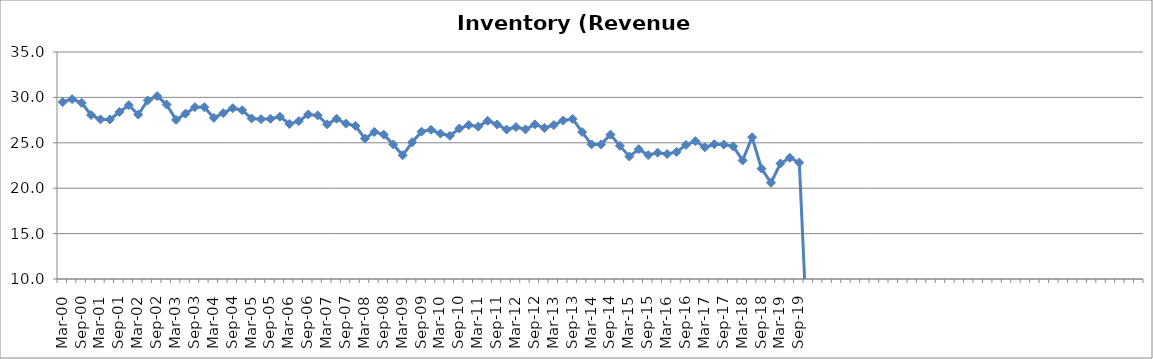
| Category | Inventory (Revenue Days) |
|---|---|
| Mar-00 | 29.487 |
| Jun-00 | 29.806 |
| Sep-00 | 29.403 |
| Dec-00 | 28.06 |
| Mar-01 | 27.572 |
| Jun-01 | 27.572 |
| Sep-01 | 28.397 |
| Dec-01 | 29.145 |
| Mar-02 | 28.109 |
| Jun-02 | 29.663 |
| Sep-02 | 30.14 |
| Dec-02 | 29.213 |
| Mar-03 | 27.527 |
| Jun-03 | 28.21 |
| Sep-03 | 28.927 |
| Dec-03 | 28.922 |
| Mar-04 | 27.749 |
| Jun-04 | 28.277 |
| Sep-04 | 28.811 |
| Dec-04 | 28.595 |
| Mar-05 | 27.682 |
| Jun-05 | 27.602 |
| Sep-05 | 27.646 |
| Dec-05 | 27.874 |
| Mar-06 | 27.076 |
| Jun-06 | 27.39 |
| Sep-06 | 28.121 |
| Dec-06 | 28.019 |
| Mar-07 | 27.029 |
| Jun-07 | 27.649 |
| Sep-07 | 27.109 |
| Dec-07 | 26.859 |
| Mar-08 | 25.462 |
| Jun-08 | 26.198 |
| Sep-08 | 25.895 |
| Dec-08 | 24.821 |
| Mar-09 | 23.627 |
| Jun-09 | 25.059 |
| Sep-09 | 26.23 |
| Dec-09 | 26.431 |
| Mar-10 | 26.018 |
| Jun-10 | 25.771 |
| Sep-10 | 26.58 |
| Dec-10 | 26.957 |
| Mar-11 | 26.786 |
| Jun-11 | 27.426 |
| Sep-11 | 27.021 |
| Dec-11 | 26.462 |
| Mar-12 | 26.738 |
| Jun-12 | 26.477 |
| Sep-12 | 27.03 |
| Dec-12 | 26.629 |
| Mar-13 | 26.955 |
| Jun-13 | 27.454 |
| Sep-13 | 27.629 |
| Dec-13 | 26.183 |
| Mar-14 | 24.819 |
| Jun-14 | 24.823 |
| Sep-14 | 25.901 |
| Dec-14 | 24.661 |
| Mar-15 | 23.492 |
| Jun-15 | 24.295 |
| Sep-15 | 23.648 |
| Dec-15 | 23.914 |
| Mar-16 | 23.764 |
| Jun-16 | 23.998 |
| Sep-16 | 24.762 |
| Dec-16 | 25.178 |
| Mar-17 | 24.513 |
| Jun-17 | 24.844 |
| Sep-17 | 24.809 |
| Dec-17 | 24.608 |
| Mar-18 | 23.059 |
| Jun-18 | 25.616 |
| Sep-18 | 22.157 |
| Dec-18 | 20.6 |
| Mar-19 | 22.721 |
| Jun-19 | 23.35 |
| Sep-19 | 22.819 |